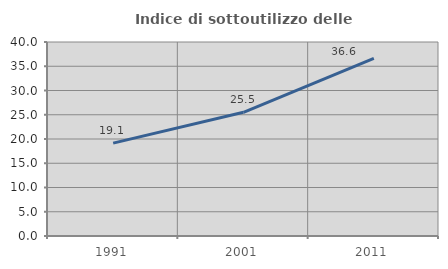
| Category | Indice di sottoutilizzo delle abitazioni  |
|---|---|
| 1991.0 | 19.149 |
| 2001.0 | 25.498 |
| 2011.0 | 36.626 |